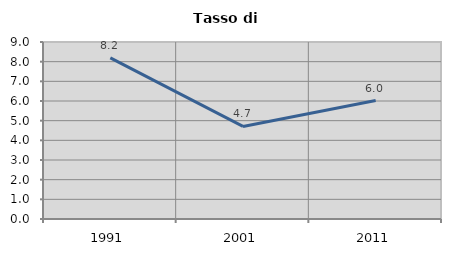
| Category | Tasso di disoccupazione   |
|---|---|
| 1991.0 | 8.19 |
| 2001.0 | 4.707 |
| 2011.0 | 6.022 |